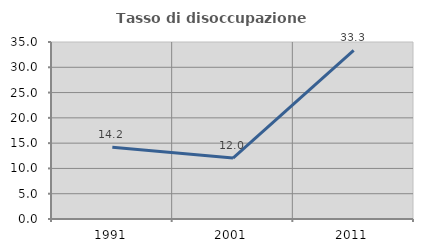
| Category | Tasso di disoccupazione giovanile  |
|---|---|
| 1991.0 | 14.211 |
| 2001.0 | 12.048 |
| 2011.0 | 33.333 |